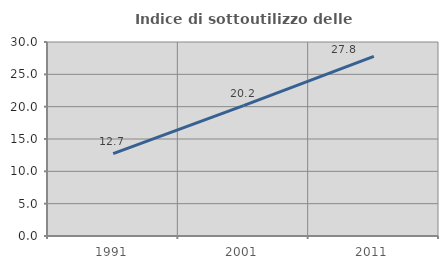
| Category | Indice di sottoutilizzo delle abitazioni  |
|---|---|
| 1991.0 | 12.734 |
| 2001.0 | 20.151 |
| 2011.0 | 27.778 |